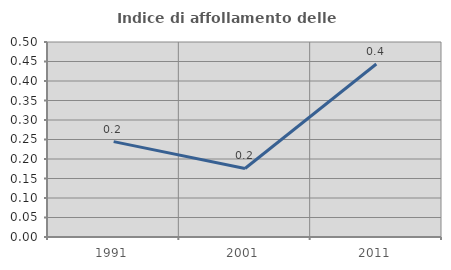
| Category | Indice di affollamento delle abitazioni  |
|---|---|
| 1991.0 | 0.244 |
| 2001.0 | 0.176 |
| 2011.0 | 0.444 |